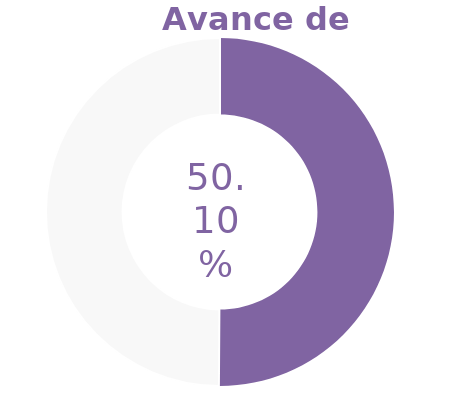
| Category | Series 0 |
|---|---|
| Acumulado 1 Trimestre | 0.501 |
| Año | -0.499 |